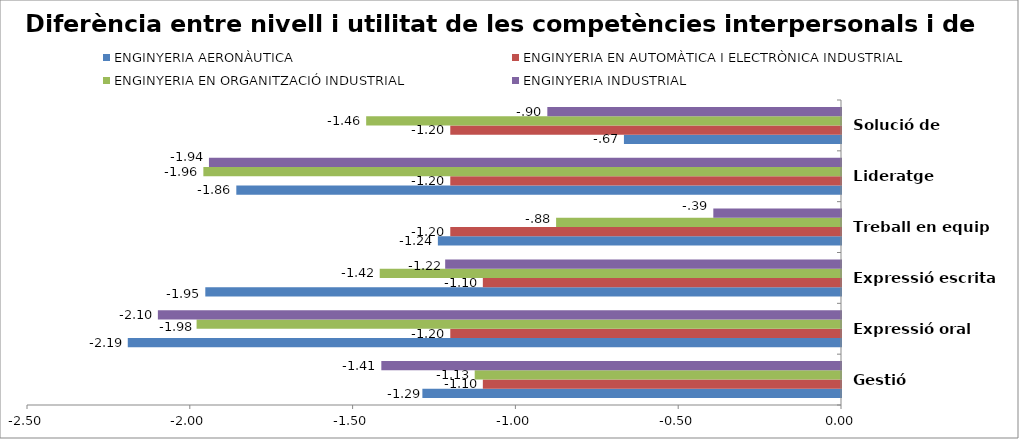
| Category | ENGINYERIA AERONÀUTICA | ENGINYERIA EN AUTOMÀTICA I ELECTRÒNICA INDUSTRIAL | ENGINYERIA EN ORGANITZACIÓ INDUSTRIAL | ENGINYERIA INDUSTRIAL |
|---|---|---|---|---|
| Gestió | -1.286 | -1.1 | -1.125 | -1.412 |
| Expressió oral | -2.19 | -1.2 | -1.979 | -2.098 |
| Expressió escrita | -1.952 | -1.1 | -1.417 | -1.216 |
| Treball en equip | -1.238 | -1.2 | -0.875 | -0.392 |
| Lideratge | -1.857 | -1.2 | -1.958 | -1.941 |
| Solució de prombles | -0.667 | -1.2 | -1.458 | -0.902 |